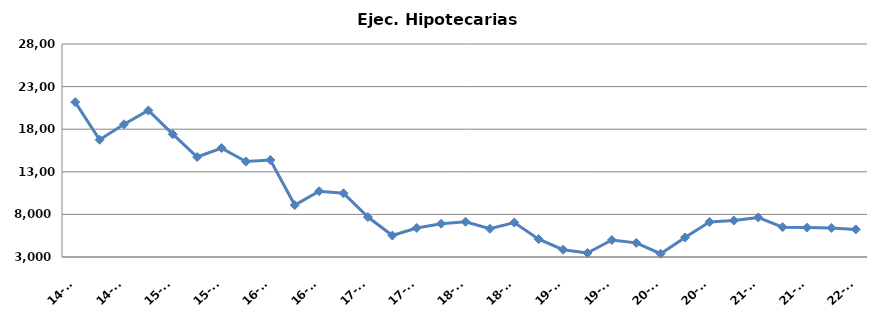
| Category | Ej. Hipotecarias |
|---|---|
| 14-T2 | 21178 |
| 14-T3 | 16767 |
| 14-T4 | 18578 |
| 15-T1 | 20201 |
| 15-T2 | 17414 |
| 15-T3 | 14735 |
| 15-T4 | 15785 |
| 16-T1 | 14205 |
| 16-T2 | 14385 |
| 16-T3 | 9094 |
| 16-T4 | 10726 |
| 17-T1 | 10478 |
| 17-T2 | 7689 |
| 17-T3 | 5518 |
| 17-T4 | 6409 |
| 18-T1 | 6903 |
| 18-T2 | 7137 |
| 18-T3 | 6315 |
| 18-T4 | 7049 |
| 19-T1 | 5092 |
| 19-T2 | 3857 |
| 19-T3 | 3470 |
| 19-T4 | 4992 |
| 20-T1 | 4658 |
| 20-T2 | 3387 |
| 20-T3 | 5299 |
| 20-T4 | 7116 |
| 21-T1 | 7280 |
| 21-T2 | 7641 |
| 21-T3 | 6504 |
| 21-T4 | 6449 |
| 22-T1 | 6410 |
| 22-T2 | 6242 |